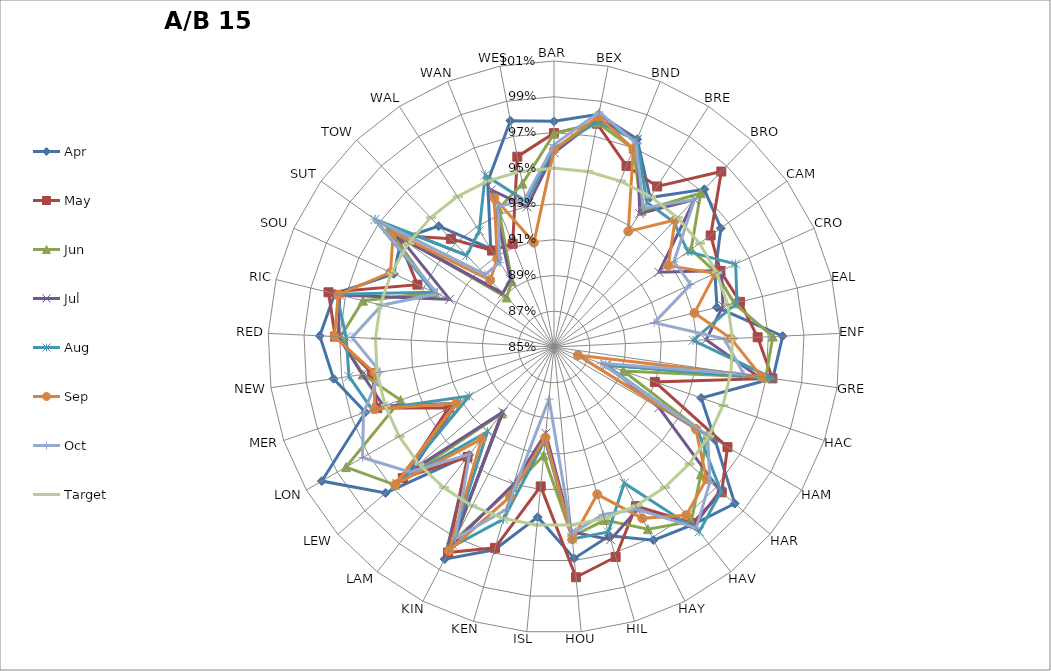
| Category | Apr | May  | Jun | Jul | Aug | Sep | Oct | Target |
|---|---|---|---|---|---|---|---|---|
| BAR | 0.976 | 0.97 | 0.969 | 0.959 | 0.961 | 0.96 | 0.963 | 0.95 |
| BEX | 0.983 | 0.977 | 0.978 | 0.98 | 0.978 | 0.981 | 0.984 | 0.95 |
| BND | 0.975 | 0.959 | 0.97 | 0.975 | 0.975 | 0.969 | 0.973 | 0.95 |
| BRE | 0.949 | 0.957 | 0.941 | 0.939 | 0.946 | 0.927 | 0.943 | 0.95 |
| BRO | 0.972 | 0.986 | 0.969 | 0.964 | 0.947 | 0.948 | 0.964 | 0.95 |
| CAM | 0.965 | 0.958 | 0.944 | 0.922 | 0.942 | 0.928 | 0.932 | 0.95 |
| CRO | 0.949 | 0.952 | 0.95 | 0.953 | 0.962 | 0.949 | 0.934 | 0.95 |
| EAL | 0.944 | 0.957 | 0.954 | 0.947 | 0.955 | 0.931 | 0.908 | 0.95 |
| ENF | 0.978 | 0.964 | 0.973 | 0.935 | 0.928 | 0.949 | 0.945 | 0.95 |
| GRE | 0.974 | 0.973 | 0.97 | 0.965 | 0.974 | 0.967 | 0.957 | 0.95 |
| HAC | 0.937 | 0.91 | 0.891 | 0.881 | 0.881 | 0.864 | 0.878 | 0.95 |
| HAM | 0.954 | 0.962 | 0.949 | 0.918 | 0.943 | 0.942 | 0.949 | 0.95 |
| HAR | 0.984 | 0.974 | 0.959 | 0.973 | 0.974 | 0.963 | 0.965 | 0.95 |
| HAV | 0.976 | 0.975 | 0.974 | 0.977 | 0.981 | 0.97 | 0.979 | 0.95 |
| HAY | 0.972 | 0.95 | 0.965 | 0.952 | 0.936 | 0.958 | 0.952 | 0.95 |
| HIL | 0.96 | 0.972 | 0.951 | 0.962 | 0.958 | 0.936 | 0.948 | 0.95 |
| HOU | 0.969 | 0.979 | 0.956 | 0.954 | 0.958 | 0.958 | 0.955 | 0.95 |
| ISL | 0.946 | 0.928 | 0.911 | 0.898 | 0.902 | 0.901 | 0.879 | 0.95 |
| KEN | 0.968 | 0.967 | 0.932 | 0.93 | 0.95 | 0.937 | 0.945 | 0.95 |
| KIN | 0.984 | 0.979 | 0.972 | 0.974 | 0.976 | 0.978 | 0.971 | 0.95 |
| LAM | 0.927 | 0.928 | 0.897 | 0.896 | 0.91 | 0.916 | 0.926 | 0.95 |
| LEW | 0.975 | 0.962 | 0.968 | 0.956 | 0.966 | 0.967 | 0.957 | 0.95 |
| LON | 1 | 0.918 | 0.984 | 0.913 | 0.905 | 0.913 | 0.974 | 0.95 |
| MER | 0.962 | 0.955 | 0.941 | 0.951 | 0.958 | 0.956 | 0.963 | 0.95 |
| NEW | 0.975 | 0.953 | 0.958 | 0.958 | 0.966 | 0.951 | 0.948 | 0.95 |
| RED | 0.981 | 0.973 | 0.97 | 0.971 | 0.966 | 0.973 | 0.963 | 0.95 |
| RIC | 0.976 | 0.98 | 0.96 | 0.973 | 0.975 | 0.974 | 0.949 | 0.95 |
| SOU | 0.949 | 0.934 | 0.923 | 0.914 | 0.924 | 0.951 | 0.922 | 0.95 |
| SUT | 0.955 | 0.958 | 0.964 | 0.956 | 0.973 | 0.96 | 0.973 | 0.95 |
| TOW | 0.943 | 0.934 | 0.888 | 0.891 | 0.921 | 0.902 | 0.906 | 0.95 |
| WAL | 0.915 | 0.914 | 0.894 | 0.895 | 0.927 | 0.909 | 0.906 | 0.95 |
| WAN | 0.95 | 0.912 | 0.933 | 0.945 | 0.954 | 0.94 | 0.934 | 0.95 |
| WES | 0.979 | 0.958 | 0.943 | 0.93 | 0.933 | 0.909 | 0.935 | 0.95 |